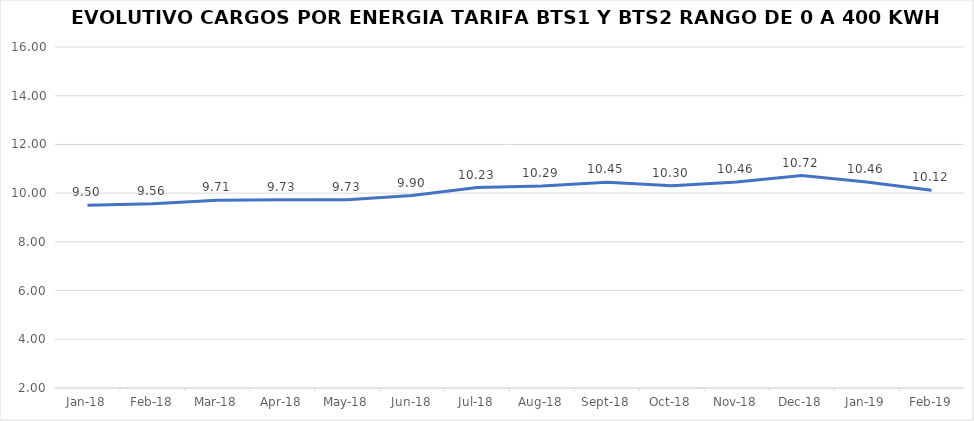
| Category | Series 0 |
|---|---|
| 2018-01-01 | 9.5 |
| 2018-02-01 | 9.56 |
| 2018-03-01 | 9.71 |
| 2018-04-01 | 9.73 |
| 2018-05-01 | 9.73 |
| 2018-06-01 | 9.9 |
| 2018-07-01 | 10.23 |
| 2018-08-01 | 10.29 |
| 2018-09-01 | 10.45 |
| 2018-10-01 | 10.3 |
| 2018-11-01 | 10.46 |
| 2018-12-01 | 10.72 |
| 2019-01-01 | 10.46 |
| 2019-02-01 | 10.12 |